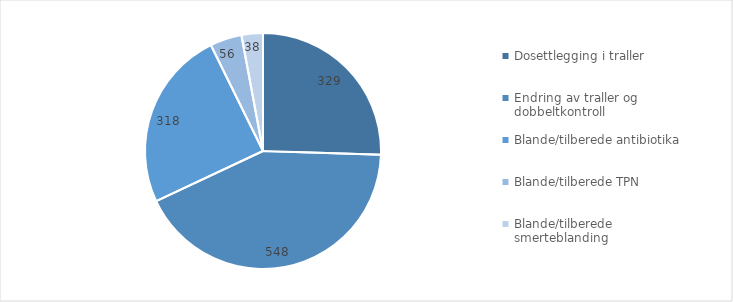
| Category | Series 0 |
|---|---|
| Dosettlegging i traller | 328.5 |
| Endring av traller og dobbeltkontroll | 547.5 |
| Blande/tilberede antibiotika | 318.112 |
| Blande/tilberede TPN | 56 |
| Blande/tilberede smerteblanding | 37.8 |